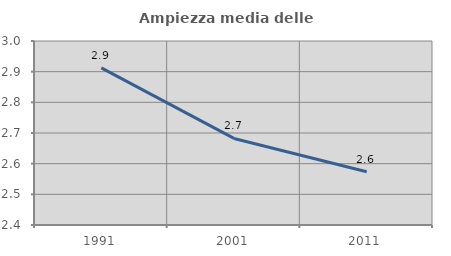
| Category | Ampiezza media delle famiglie |
|---|---|
| 1991.0 | 2.913 |
| 2001.0 | 2.682 |
| 2011.0 | 2.574 |